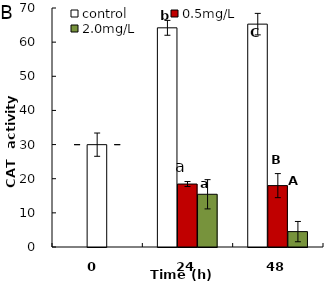
| Category | control | 0.5mg/L | 2.0mg/L |
|---|---|---|---|
| 0.0 | 29.971 | 29.971 | 29.971 |
| 24.0 | 64.194 | 18.442 | 15.443 |
| 48.0 | 65.275 | 17.977 | 4.508 |